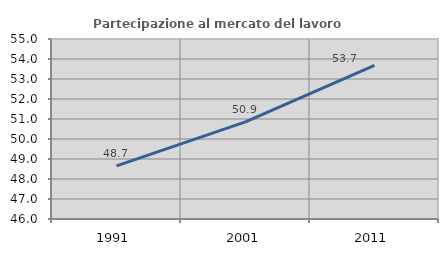
| Category | Partecipazione al mercato del lavoro  femminile |
|---|---|
| 1991.0 | 48.653 |
| 2001.0 | 50.859 |
| 2011.0 | 53.676 |